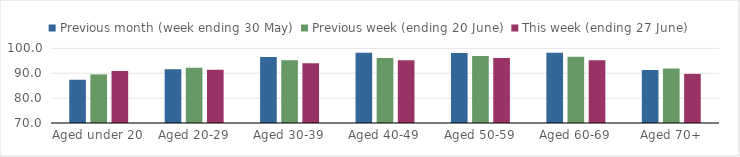
| Category | Previous month (week ending 30 May) | Previous week (ending 20 June) | This week (ending 27 June) |
|---|---|---|---|
| Aged under 20 | 87.401 | 89.548 | 90.898 |
| Aged 20-29 | 91.624 | 92.206 | 91.42 |
| Aged 30-39 | 96.564 | 95.235 | 94.047 |
| Aged 40-49 | 98.249 | 96.148 | 95.271 |
| Aged 50-59 | 98.159 | 96.983 | 96.138 |
| Aged 60-69 | 98.265 | 96.675 | 95.236 |
| Aged 70+ | 91.275 | 91.946 | 89.765 |